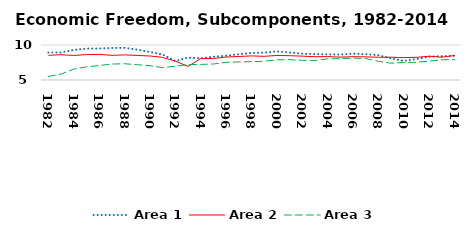
| Category | Area 1 | Area 2 | Area 3 |
|---|---|---|---|
| 1982.0 | 8.925 | 8.526 | 5.498 |
| 1983.0 | 8.931 | 8.609 | 5.841 |
| 1984.0 | 9.3 | 8.506 | 6.558 |
| 1985.0 | 9.494 | 8.632 | 6.875 |
| 1986.0 | 9.498 | 8.66 | 7.069 |
| 1987.0 | 9.577 | 8.522 | 7.276 |
| 1988.0 | 9.594 | 8.589 | 7.323 |
| 1989.0 | 9.341 | 8.509 | 7.182 |
| 1990.0 | 9.001 | 8.431 | 7.048 |
| 1991.0 | 8.649 | 8.229 | 6.765 |
| 1992.0 | 7.707 | 7.697 | 6.976 |
| 1993.0 | 8.201 | 6.935 | 7.195 |
| 1994.0 | 8.088 | 8.058 | 7.23 |
| 1995.0 | 8.322 | 8.073 | 7.284 |
| 1996.0 | 8.464 | 8.282 | 7.522 |
| 1997.0 | 8.677 | 8.361 | 7.584 |
| 1998.0 | 8.862 | 8.444 | 7.616 |
| 1999.0 | 8.907 | 8.386 | 7.677 |
| 2000.0 | 9.086 | 8.504 | 7.877 |
| 2001.0 | 8.923 | 8.472 | 7.904 |
| 2002.0 | 8.76 | 8.408 | 7.816 |
| 2003.0 | 8.707 | 8.326 | 7.796 |
| 2004.0 | 8.653 | 8.348 | 8.027 |
| 2005.0 | 8.627 | 8.266 | 8.051 |
| 2006.0 | 8.763 | 8.331 | 8.122 |
| 2007.0 | 8.686 | 8.304 | 8.068 |
| 2008.0 | 8.541 | 8.241 | 7.664 |
| 2009.0 | 8.089 | 8.254 | 7.402 |
| 2010.0 | 7.723 | 8.197 | 7.494 |
| 2011.0 | 8.004 | 8.242 | 7.536 |
| 2012.0 | 8.342 | 8.394 | 7.704 |
| 2013.0 | 8.404 | 8.259 | 7.892 |
| 2014.0 | 8.469 | 8.496 | 7.901 |